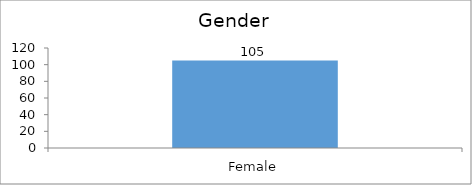
| Category | Gender |
|---|---|
| Female | 105 |